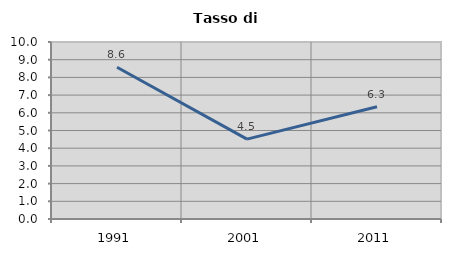
| Category | Tasso di disoccupazione   |
|---|---|
| 1991.0 | 8.576 |
| 2001.0 | 4.512 |
| 2011.0 | 6.341 |